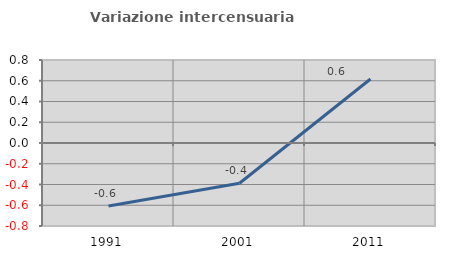
| Category | Variazione intercensuaria annua |
|---|---|
| 1991.0 | -0.607 |
| 2001.0 | -0.388 |
| 2011.0 | 0.617 |